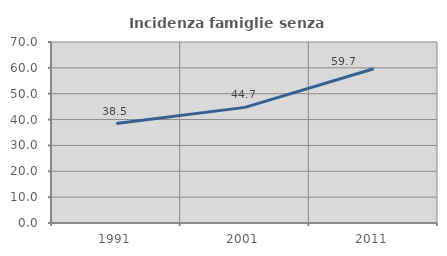
| Category | Incidenza famiglie senza nuclei |
|---|---|
| 1991.0 | 38.462 |
| 2001.0 | 44.715 |
| 2011.0 | 59.672 |